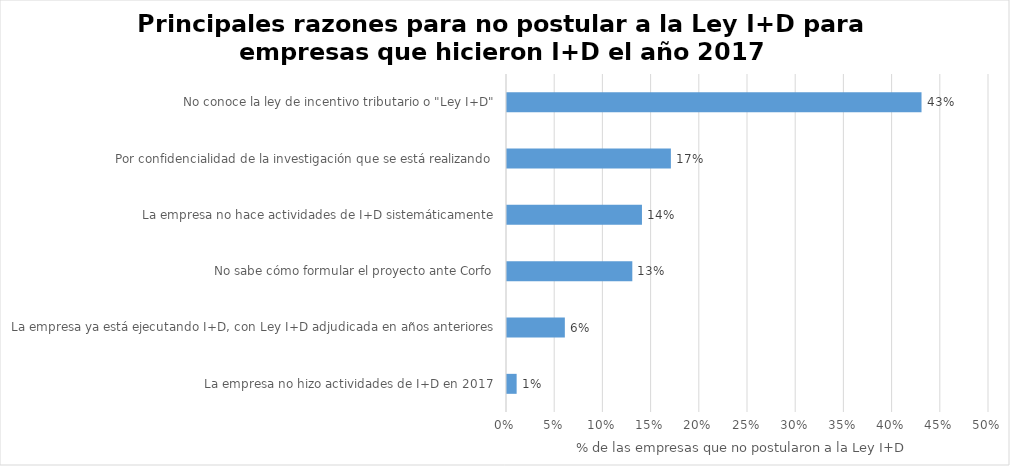
| Category | Series 0 |
|---|---|
| La empresa no hizo actividades de I+D en 2017 | 0.01 |
| La empresa ya está ejecutando I+D, con Ley I+D adjudicada en años anteriores | 0.06 |
| No sabe cómo formular el proyecto ante Corfo | 0.13 |
| La empresa no hace actividades de I+D sistemáticamente | 0.14 |
| Por confidencialidad de la investigación que se está realizando | 0.17 |
| No conoce la ley de incentivo tributario o "Ley I+D" | 0.43 |